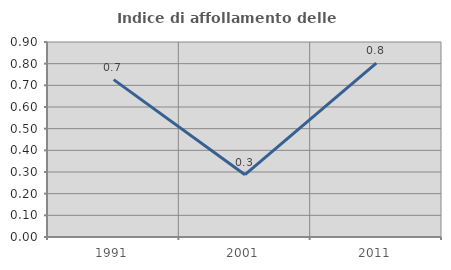
| Category | Indice di affollamento delle abitazioni  |
|---|---|
| 1991.0 | 0.726 |
| 2001.0 | 0.288 |
| 2011.0 | 0.802 |